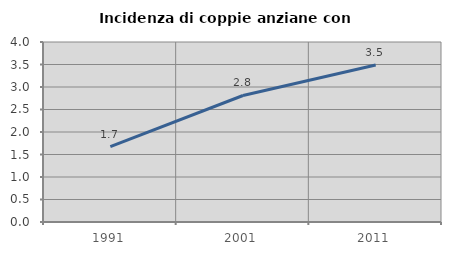
| Category | Incidenza di coppie anziane con figli |
|---|---|
| 1991.0 | 1.677 |
| 2001.0 | 2.811 |
| 2011.0 | 3.491 |